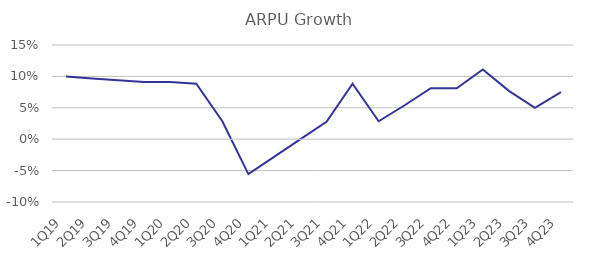
| Category | ARPU Growth |
|---|---|
| 1Q19 | 0.1 |
| 2Q19 | 0.097 |
| 3Q19 | 0.094 |
| 4Q19 | 0.091 |
| 1Q20 | 0.091 |
| 2Q20 | 0.088 |
| 3Q20 | 0.029 |
| 4Q20 | -0.056 |
| 1Q21 | -0.028 |
| 2Q21 | 0 |
| 3Q21 | 0.028 |
| 4Q21 | 0.088 |
| 1Q22 | 0.029 |
| 2Q22 | 0.054 |
| 3Q22 | 0.081 |
| 4Q22 | 0.081 |
| 1Q23 | 0.111 |
| 2Q23 | 0.077 |
| 3Q23 | 0.05 |
| 4Q23 | 0.075 |